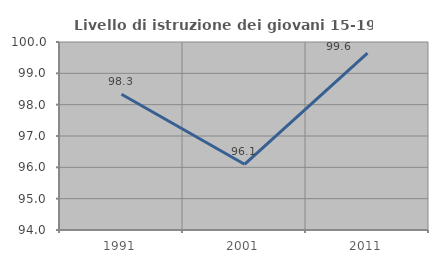
| Category | Livello di istruzione dei giovani 15-19 anni |
|---|---|
| 1991.0 | 98.332 |
| 2001.0 | 96.097 |
| 2011.0 | 99.647 |